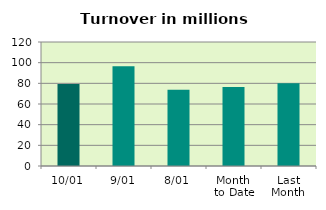
| Category | Series 0 |
|---|---|
| 10/01 | 79.298 |
| 9/01 | 96.439 |
| 8/01 | 73.68 |
| Month 
to Date | 76.398 |
| Last
Month | 79.992 |